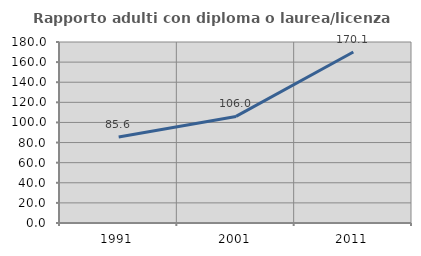
| Category | Rapporto adulti con diploma o laurea/licenza media  |
|---|---|
| 1991.0 | 85.561 |
| 2001.0 | 106.009 |
| 2011.0 | 170.098 |